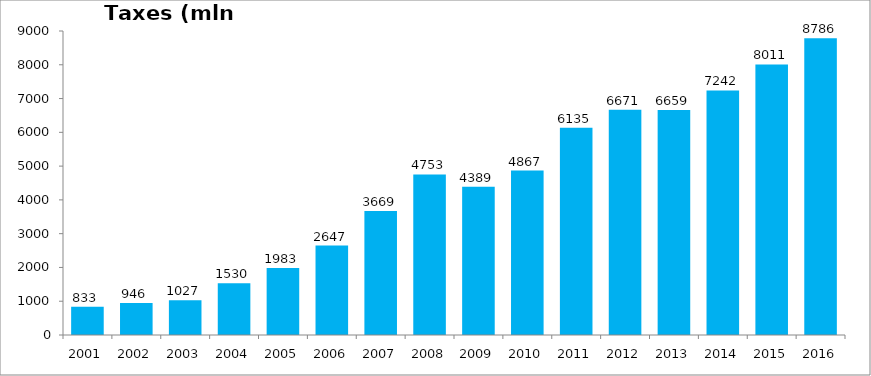
| Category | Taxes (mln GEL) |
|---|---|
| 2001.0 | 833.166 |
| 2002.0 | 946.194 |
| 2003.0 | 1027.441 |
| 2004.0 | 1530.251 |
| 2005.0 | 1982.665 |
| 2006.0 | 2646.541 |
| 2007.0 | 3669.089 |
| 2008.0 | 4752.657 |
| 2009.0 | 4388.874 |
| 2010.0 | 4867.441 |
| 2011.0 | 6134.752 |
| 2012.0 | 6670.969 |
| 2013.0 | 6659.296 |
| 2014.0 | 7242 |
| 2015.0 | 8010.855 |
| 2016.0 | 8786.065 |